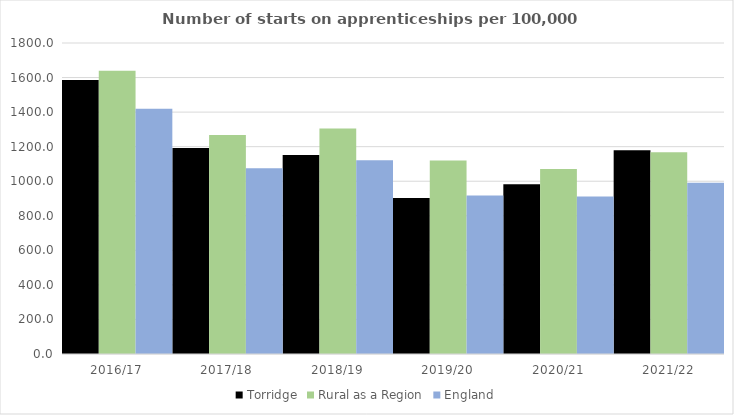
| Category | Torridge | Rural as a Region | England |
|---|---|---|---|
| 2016/17 | 1586 | 1638.789 | 1420 |
| 2017/18 | 1193 | 1267.474 | 1075 |
| 2018/19 | 1152 | 1304.57 | 1122 |
| 2019/20 | 903 | 1119.662 | 918 |
| 2020/21 | 982 | 1070.748 | 912 |
| 2021/22 | 1179 | 1167.68 | 991 |